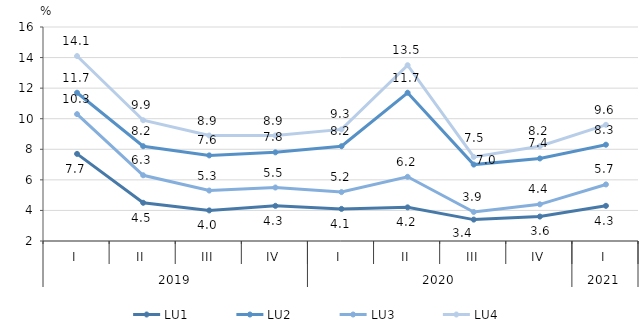
| Category | LU1 | LU2 | LU3 | LU4 |
|---|---|---|---|---|
| 0 | 7.7 | 11.7 | 10.3 | 14.1 |
| 1 | 4.5 | 8.2 | 6.3 | 9.9 |
| 2 | 4 | 7.6 | 5.3 | 8.9 |
| 3 | 4.3 | 7.8 | 5.5 | 8.9 |
| 4 | 4.1 | 8.2 | 5.2 | 9.3 |
| 5 | 4.2 | 11.7 | 6.2 | 13.5 |
| 6 | 3.4 | 7 | 3.9 | 7.5 |
| 7 | 3.6 | 7.4 | 4.4 | 8.2 |
| 8 | 4.3 | 8.3 | 5.7 | 9.6 |